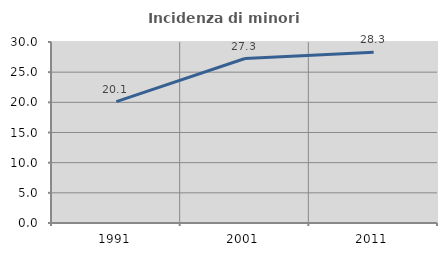
| Category | Incidenza di minori stranieri |
|---|---|
| 1991.0 | 20.122 |
| 2001.0 | 27.259 |
| 2011.0 | 28.297 |